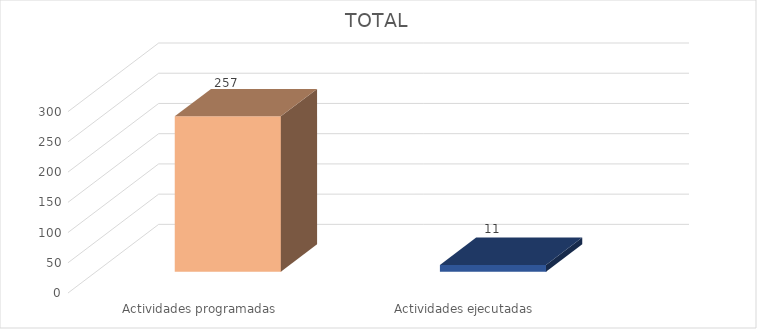
| Category | TOTAL |
|---|---|
| Actividades programadas | 257 |
| Actividades ejecutadas | 11 |